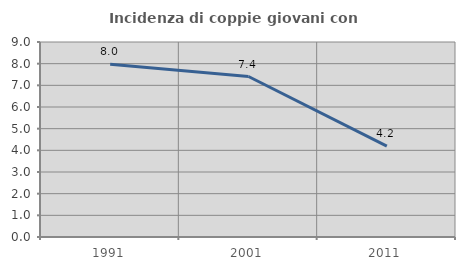
| Category | Incidenza di coppie giovani con figli |
|---|---|
| 1991.0 | 7.975 |
| 2001.0 | 7.407 |
| 2011.0 | 4.194 |